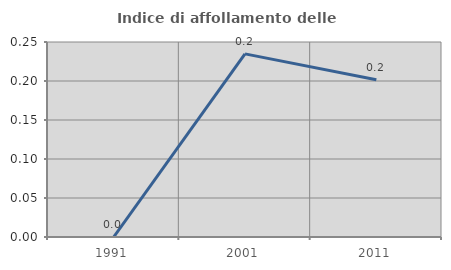
| Category | Indice di affollamento delle abitazioni  |
|---|---|
| 1991.0 | 0 |
| 2001.0 | 0.235 |
| 2011.0 | 0.202 |